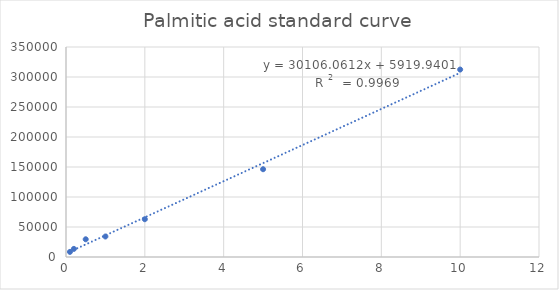
| Category | Series 0 |
|---|---|
| 0.1 | 8519.819 |
| 0.2 | 13509.451 |
| 0.5 | 29545.609 |
| 1.0 | 34156.551 |
| 2.0 | 62992.508 |
| 5.0 | 146289.906 |
| 10.0 | 312419.688 |